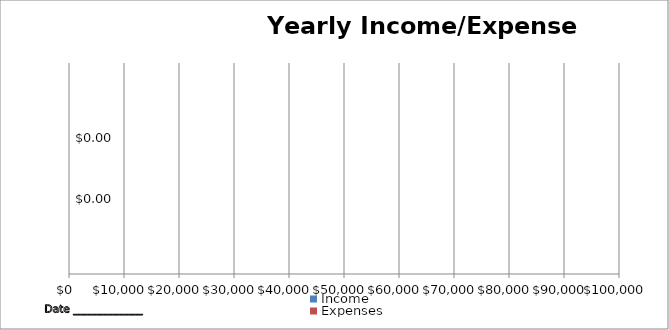
| Category | Income | Expenses |
|---|---|---|
| 0 | 0 | 0 |